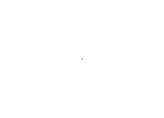
| Category | Series 0 |
|---|---|
| Available | 5827.1 |
| Picked | 0 |